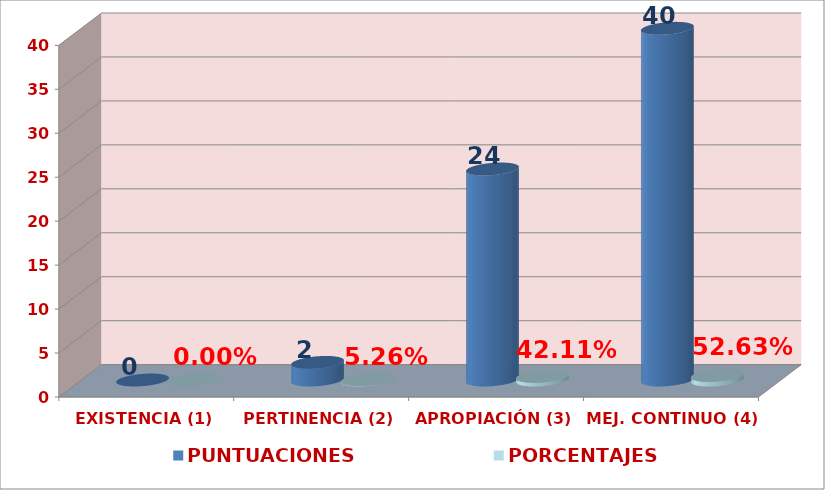
| Category | PUNTUACIONES | PORCENTAJES |
|---|---|---|
| EXISTENCIA (1) | 0 | 0 |
| PERTINENCIA (2) | 2 | 0.053 |
| APROPIACIÓN (3) | 24 | 0.421 |
| MEJ. CONTINUO (4) | 40 | 0.526 |